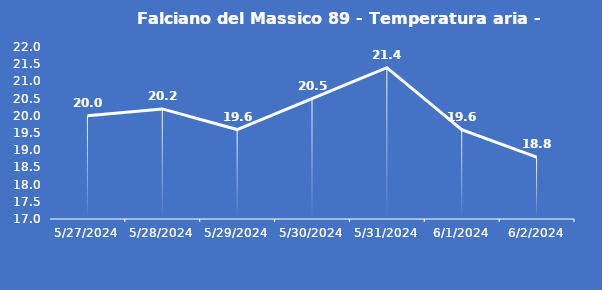
| Category | Falciano del Massico 89 - Temperatura aria - Grezzo (°C) |
|---|---|
| 5/27/24 | 20 |
| 5/28/24 | 20.2 |
| 5/29/24 | 19.6 |
| 5/30/24 | 20.5 |
| 5/31/24 | 21.4 |
| 6/1/24 | 19.6 |
| 6/2/24 | 18.8 |